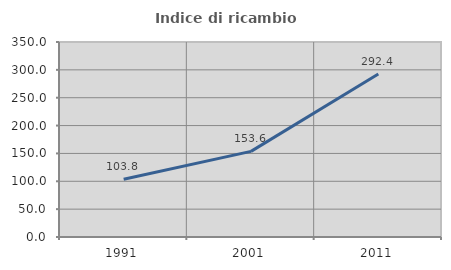
| Category | Indice di ricambio occupazionale  |
|---|---|
| 1991.0 | 103.774 |
| 2001.0 | 153.645 |
| 2011.0 | 292.442 |